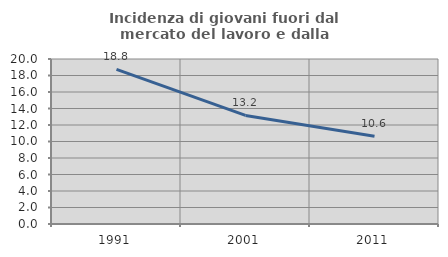
| Category | Incidenza di giovani fuori dal mercato del lavoro e dalla formazione  |
|---|---|
| 1991.0 | 18.75 |
| 2001.0 | 13.158 |
| 2011.0 | 10.638 |